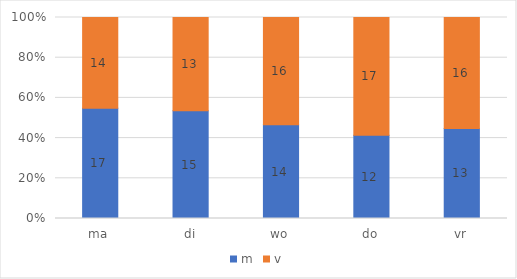
| Category | m | v |
|---|---|---|
| ma | 17 | 14 |
| di | 15 | 13 |
| wo | 14 | 16 |
| do | 12 | 17 |
| vr | 13 | 16 |